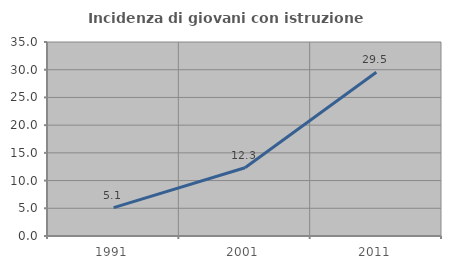
| Category | Incidenza di giovani con istruzione universitaria |
|---|---|
| 1991.0 | 5.128 |
| 2001.0 | 12.308 |
| 2011.0 | 29.545 |